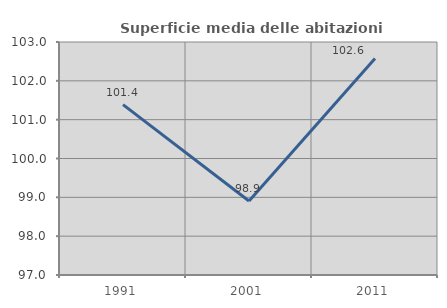
| Category | Superficie media delle abitazioni occupate |
|---|---|
| 1991.0 | 101.386 |
| 2001.0 | 98.906 |
| 2011.0 | 102.576 |